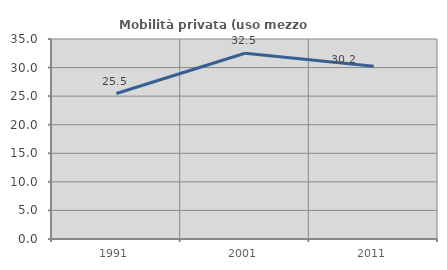
| Category | Mobilità privata (uso mezzo privato) |
|---|---|
| 1991.0 | 25.455 |
| 2001.0 | 32.5 |
| 2011.0 | 30.233 |